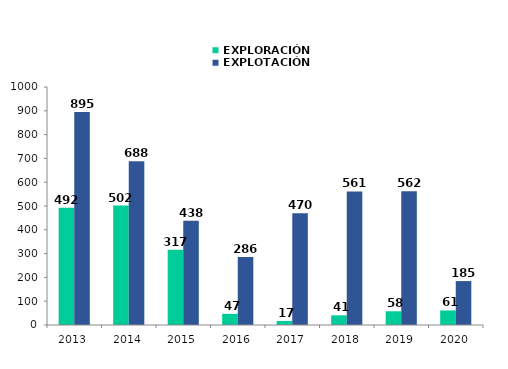
| Category | EXPLORACIÓN | EXPLOTACIÓN |
|---|---|---|
| 2013.0 | 492.44 | 895.41 |
| 2014.0 | 501.76 | 688.01 |
| 2015.0 | 316.69 | 438.23 |
| 2016.0 | 46.95 | 285.69 |
| 2017.0 | 17.08 | 469.79 |
| 2018.0 | 40.76 | 561.17 |
| 2019.0 | 57.728 | 561.997 |
| 2020.0 | 61.1 | 184.55 |